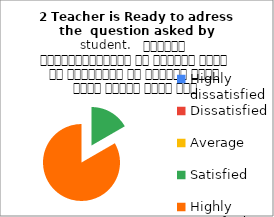
| Category | 2 Teacher is Ready to adress the  question asked by student.   शिक्षक विद्यार्थियों के द्वारा पूछे गए प्रश्नों का समाधान करने हेतु तत्पर रहते हैं |
|---|---|
| Highly dissatisfied | 0 |
| Dissatisfied | 0 |
| Average | 0 |
| Satisfied | 1 |
| Highly satisfied | 5 |